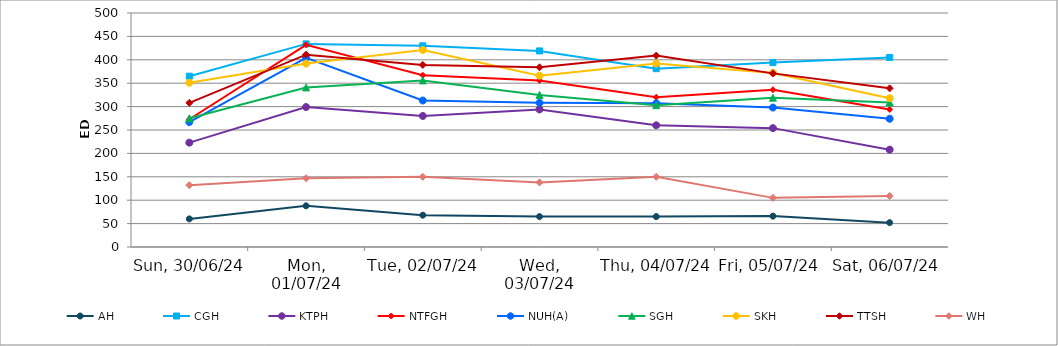
| Category | AH | CGH | KTPH | NTFGH | NUH(A) | SGH | SKH | TTSH | WH |
|---|---|---|---|---|---|---|---|---|---|
| 2024-06-30 | 60 | 365 | 223 | 273 | 267 | 275 | 351 | 308 | 132 |
| 2024-07-01 | 88 | 434 | 299 | 432 | 404 | 341 | 392 | 411 | 147 |
| 2024-07-02 | 68 | 430 | 280 | 367 | 313 | 356 | 421 | 389 | 150 |
| 2024-07-03 | 65 | 419 | 294 | 356 | 308 | 325 | 366 | 384 | 138 |
| 2024-07-04 | 65 | 381 | 260 | 320 | 307 | 303 | 392 | 409 | 150 |
| 2024-07-05 | 66 | 394 | 254 | 336 | 298 | 319 | 372 | 371 | 105 |
| 2024-07-06 | 52 | 405 | 208 | 294 | 274 | 309 | 318 | 339 | 109 |